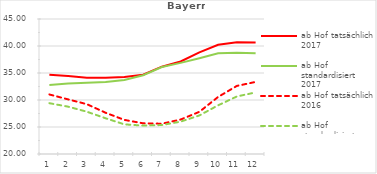
| Category | ab Hof tatsächlich 2017 | ab Hof standardisiert 2017 | ab Hof tatsächlich 2016 | ab Hof standardisiert 2016 |
|---|---|---|---|---|
| 0 | 34.67 | 32.793 | 31.025 | 29.411 |
| 1 | 34.451 | 33.034 | 30.111 | 28.767 |
| 2 | 34.129 | 33.186 | 29.227 | 27.83 |
| 3 | 34.115 | 33.327 | 27.638 | 26.616 |
| 4 | 34.247 | 33.697 | 26.313 | 25.489 |
| 5 | 34.692 | 34.595 | 25.686 | 25.26 |
| 6 | 36.167 | 36.098 | 25.608 | 25.363 |
| 7 | 37.138 | 36.878 | 26.382 | 25.992 |
| 8 | 38.807 | 37.744 | 27.808 | 27.141 |
| 9 | 40.216 | 38.654 | 30.565 | 29.015 |
| 10 | 40.709 | 38.765 | 32.611 | 30.657 |
| 11 | 40.648 | 38.678 | 33.35 | 31.404 |